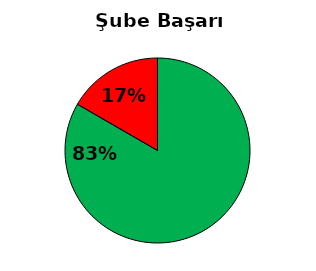
| Category | t |
|---|---|
|  | 83.333 |
|  | 16.667 |